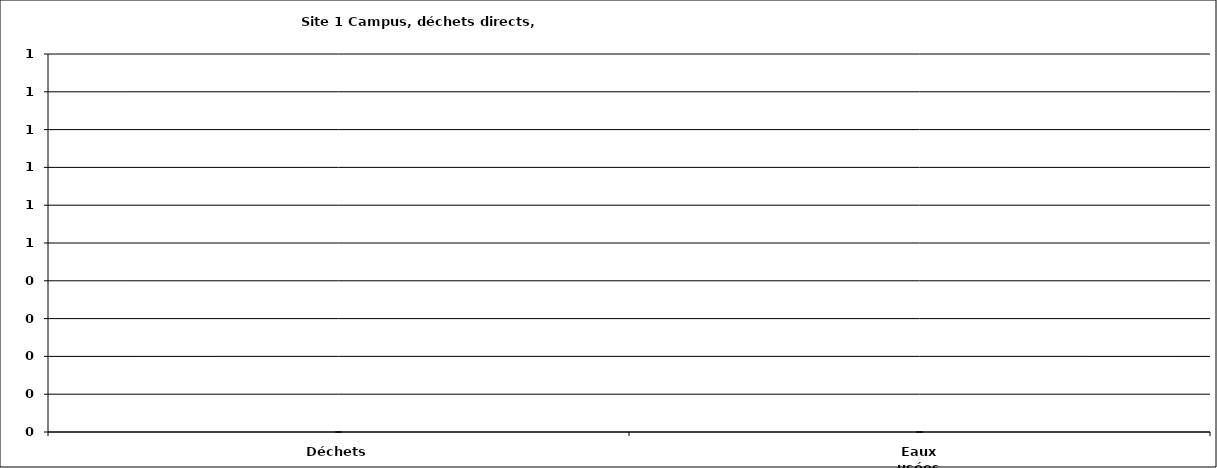
| Category | Series 0 |
|---|---|
| Déchets | 0 |
| Eaux usées | 0 |